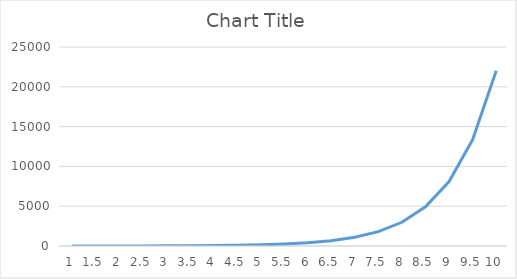
| Category | Series 0 |
|---|---|
| 1.0 | 2.718 |
| 1.5 | 4.482 |
| 2.0 | 7.389 |
| 2.5 | 12.182 |
| 3.0 | 20.086 |
| 3.5 | 33.115 |
| 4.0 | 54.598 |
| 4.5 | 90.017 |
| 5.0 | 148.413 |
| 5.5 | 244.692 |
| 6.0 | 403.429 |
| 6.5 | 665.142 |
| 7.0 | 1096.633 |
| 7.5 | 1808.042 |
| 8.0 | 2980.958 |
| 8.5 | 4914.769 |
| 9.0 | 8103.084 |
| 9.5 | 13359.727 |
| 10.0 | 22026.466 |